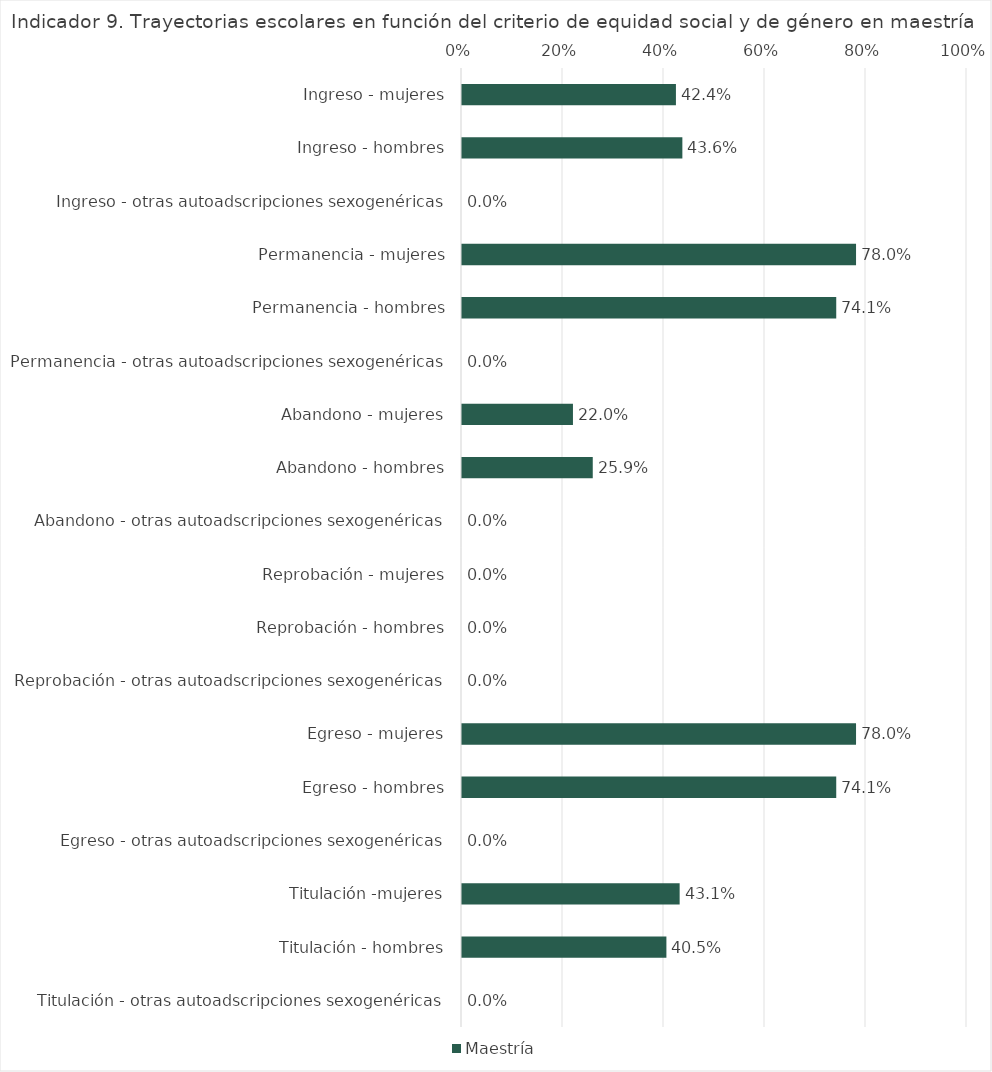
| Category | Maestría |
|---|---|
| Ingreso - mujeres | 0.424 |
| Ingreso - hombres | 0.436 |
| Ingreso - otras autoadscripciones sexogenéricas | 0 |
| Permanencia - mujeres | 0.78 |
| Permanencia - hombres | 0.741 |
| Permanencia - otras autoadscripciones sexogenéricas | 0 |
| Abandono - mujeres | 0.22 |
| Abandono - hombres | 0.259 |
| Abandono - otras autoadscripciones sexogenéricas | 0 |
| Reprobación - mujeres | 0 |
| Reprobación - hombres | 0 |
| Reprobación - otras autoadscripciones sexogenéricas | 0 |
| Egreso - mujeres | 0.78 |
| Egreso - hombres | 0.741 |
| Egreso - otras autoadscripciones sexogenéricas | 0 |
| Titulación -mujeres | 0.431 |
| Titulación - hombres | 0.405 |
| Titulación - otras autoadscripciones sexogenéricas | 0 |